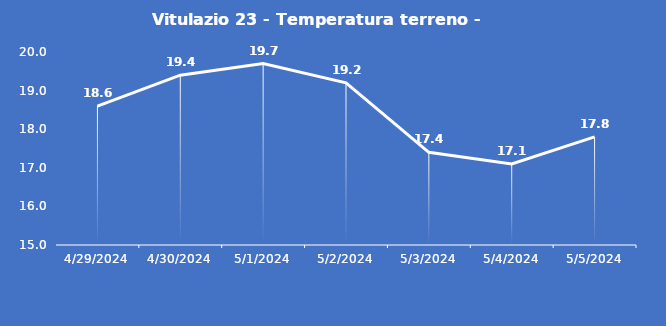
| Category | Vitulazio 23 - Temperatura terreno - Grezzo (°C) |
|---|---|
| 4/29/24 | 18.6 |
| 4/30/24 | 19.4 |
| 5/1/24 | 19.7 |
| 5/2/24 | 19.2 |
| 5/3/24 | 17.4 |
| 5/4/24 | 17.1 |
| 5/5/24 | 17.8 |